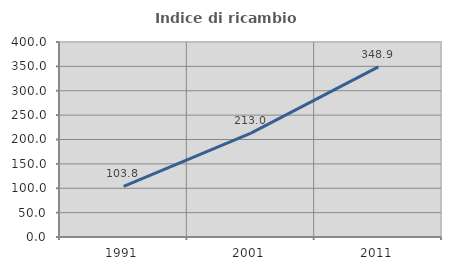
| Category | Indice di ricambio occupazionale  |
|---|---|
| 1991.0 | 103.759 |
| 2001.0 | 213.043 |
| 2011.0 | 348.889 |